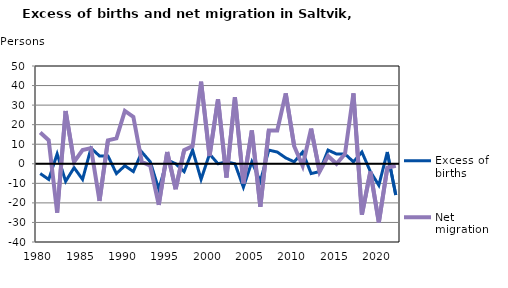
| Category | Excess of births | Net migration |
|---|---|---|
| 1980.0 | -5 | 16 |
| 1981.0 | -8 | 12 |
| 1982.0 | 5 | -25 |
| 1983.0 | -9 | 27 |
| 1984.0 | -2 | 1 |
| 1985.0 | -8 | 7 |
| 1986.0 | 8 | 8 |
| 1987.0 | 4 | -19 |
| 1988.0 | 4 | 12 |
| 1989.0 | -5 | 13 |
| 1990.0 | -1 | 27 |
| 1991.0 | -4 | 24 |
| 1992.0 | 6 | 1 |
| 1993.0 | 1 | -1 |
| 1994.0 | -13 | -21 |
| 1995.0 | 2 | 6 |
| 1996.0 | 0 | -13 |
| 1997.0 | -4 | 7 |
| 1998.0 | 7 | 9 |
| 1999.0 | -8 | 42 |
| 2000.0 | 5 | 4 |
| 2001.0 | 0 | 33 |
| 2002.0 | 1 | -7 |
| 2003.0 | 0 | 34 |
| 2004.0 | -12 | -10 |
| 2005.0 | 1 | 17 |
| 2006.0 | -9 | -22 |
| 2007.0 | 7 | 17 |
| 2008.0 | 6 | 17 |
| 2009.0 | 3 | 36 |
| 2010.0 | 1 | 9 |
| 2011.0 | 6 | -1 |
| 2012.0 | -5 | 18 |
| 2013.0 | -4 | -4 |
| 2014.0 | 7 | 4 |
| 2015.0 | 5 | 0 |
| 2016.0 | 5 | 5 |
| 2017.0 | 1 | 36 |
| 2018.0 | 6 | -26 |
| 2019.0 | -4 | -4 |
| 2020.0 | -11 | -30 |
| 2021.0 | 6 | -2 |
| 2022.0 | -16 | -1 |